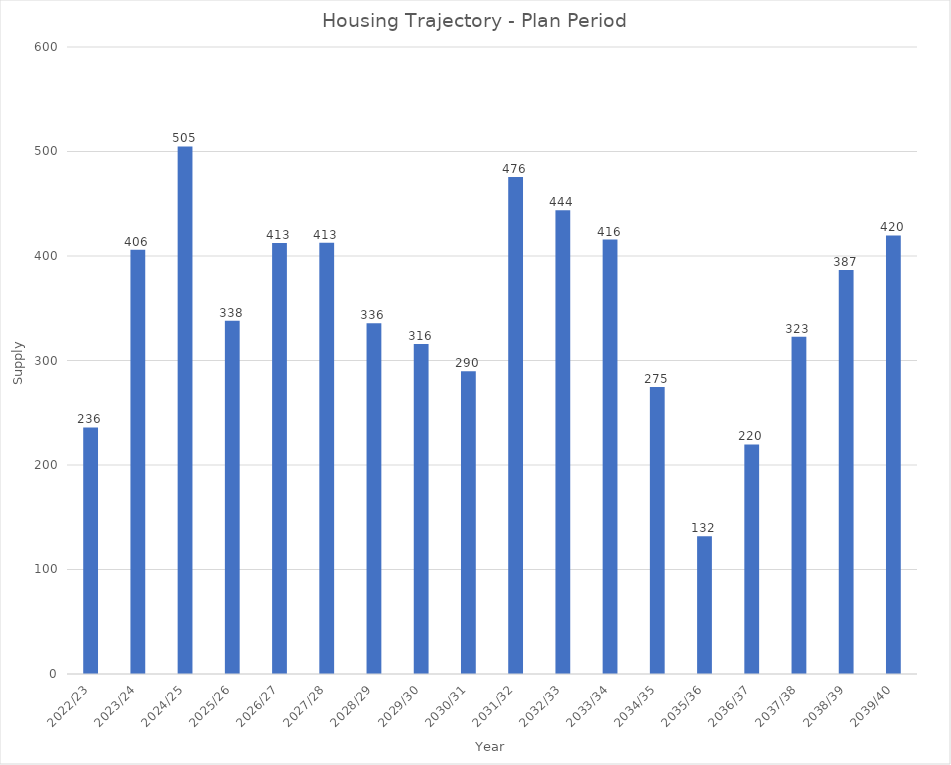
| Category | Series 0 |
|---|---|
| 2022/23 | 236 |
| 2023/24 | 406 |
| 2024/25 | 504.8 |
| 2025/26 | 338.1 |
| 2026/27 | 412.5 |
| 2027/28 | 412.7 |
| 2028/29 | 335.7 |
| 2029/30 | 315.7 |
| 2030/31 | 289.7 |
| 2031/32 | 475.7 |
| 2032/33 | 443.7 |
| 2033/34 | 415.7 |
| 2034/35 | 274.7 |
| 2035/36 | 131.7 |
| 2036/37 | 219.7 |
| 2037/38 | 322.7 |
| 2038/39 | 386.7 |
| 2039/40 | 419.7 |